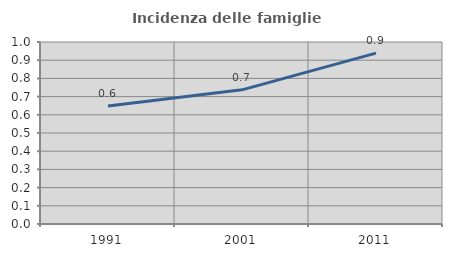
| Category | Incidenza delle famiglie numerose |
|---|---|
| 1991.0 | 0.649 |
| 2001.0 | 0.737 |
| 2011.0 | 0.939 |